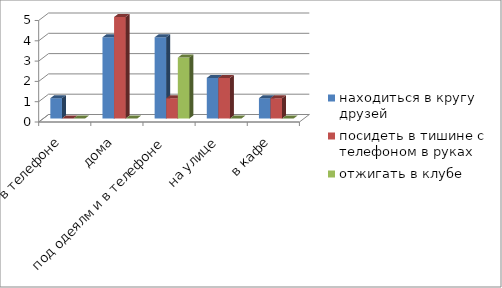
| Category | находиться в кругу друзей | посидеть в тишине с телефоном в руках | отжигать в клубе |
|---|---|---|---|
| в телефоне | 1 | 0 | 0 |
| дома | 4 | 5 | 0 |
| под одеялм и в телефоне | 4 | 1 | 3 |
| на улице | 2 | 2 | 0 |
| в кафе | 1 | 1 | 0 |